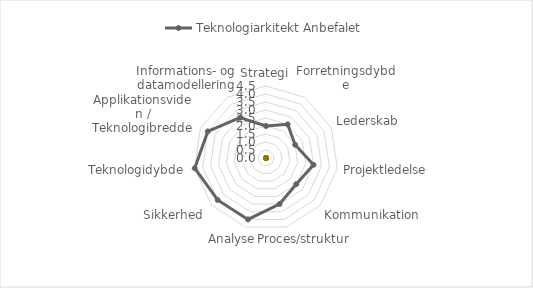
| Category | Teknologiarkitekt |
|---|---|
| Strategi |  |
| Forretningsdybde |  |
| Lederskab |  |
| Projektledelse |  |
| Kommunikation |  |
| Proces/struktur |  |
| Analyse |  |
| Sikkerhed |  |
| Teknologidybde |  |
| Applikationsviden / Teknologibredde |  |
| Informations- og datamodellering |  |